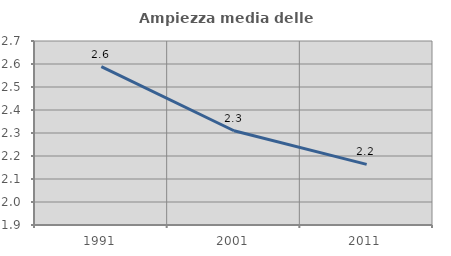
| Category | Ampiezza media delle famiglie |
|---|---|
| 1991.0 | 2.589 |
| 2001.0 | 2.31 |
| 2011.0 | 2.164 |